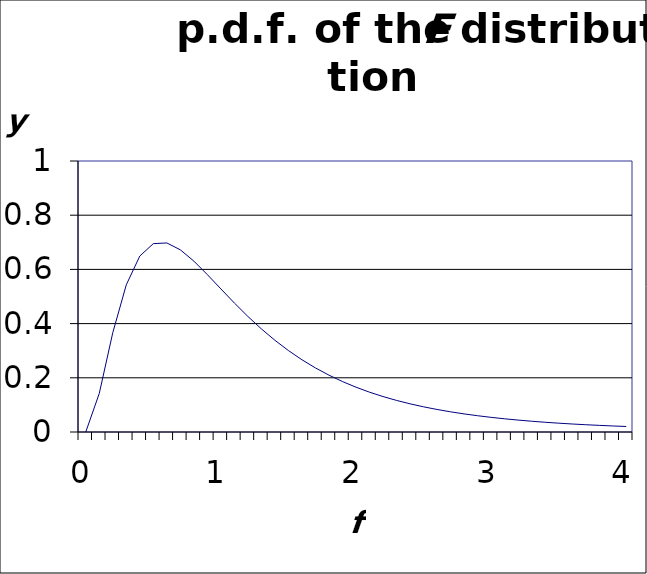
| Category | y |
|---|---|
| 0.0 | 0 |
| 0.1 | 0.142 |
| 0.2 | 0.366 |
| 0.30000000000000004 | 0.543 |
| 0.4 | 0.649 |
| 0.5 | 0.695 |
| 0.6 | 0.698 |
| 0.7 | 0.672 |
| 0.7999999999999999 | 0.631 |
| 0.8999999999999999 | 0.581 |
| 0.9999999999999999 | 0.528 |
| 1.0999999999999999 | 0.476 |
| 1.2 | 0.426 |
| 1.3 | 0.38 |
| 1.4000000000000001 | 0.338 |
| 1.5000000000000002 | 0.3 |
| 1.6000000000000003 | 0.267 |
| 1.7000000000000004 | 0.236 |
| 1.8000000000000005 | 0.21 |
| 1.9000000000000006 | 0.186 |
| 2.0000000000000004 | 0.165 |
| 2.1000000000000005 | 0.147 |
| 2.2000000000000006 | 0.131 |
| 2.3000000000000007 | 0.117 |
| 2.400000000000001 | 0.104 |
| 2.500000000000001 | 0.093 |
| 2.600000000000001 | 0.083 |
| 2.700000000000001 | 0.074 |
| 2.800000000000001 | 0.067 |
| 2.9000000000000012 | 0.06 |
| 3.0000000000000013 | 0.054 |
| 3.1000000000000014 | 0.049 |
| 3.2000000000000015 | 0.044 |
| 3.3000000000000016 | 0.04 |
| 3.4000000000000017 | 0.036 |
| 3.5000000000000018 | 0.033 |
| 3.600000000000002 | 0.03 |
| 3.700000000000002 | 0.027 |
| 3.800000000000002 | 0.024 |
| 3.900000000000002 | 0.022 |
| 4.000000000000002 | 0.02 |